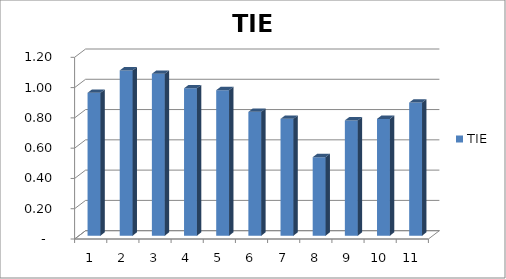
| Category | TIE |
|---|---|
| 0 | 0.944 |
| 1 | 1.091 |
| 2 | 1.069 |
| 3 | 0.973 |
| 4 | 0.961 |
| 5 | 0.818 |
| 6 | 0.771 |
| 7 | 0.518 |
| 8 | 0.761 |
| 9 | 0.771 |
| 10 | 0.879 |